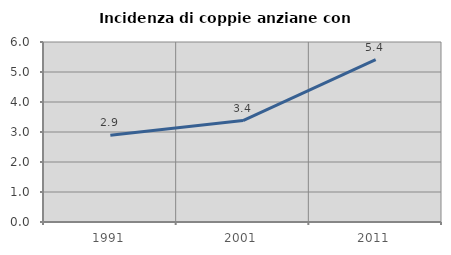
| Category | Incidenza di coppie anziane con figli |
|---|---|
| 1991.0 | 2.894 |
| 2001.0 | 3.381 |
| 2011.0 | 5.41 |